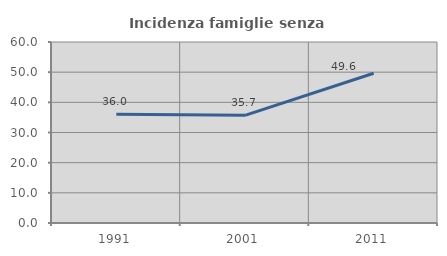
| Category | Incidenza famiglie senza nuclei |
|---|---|
| 1991.0 | 36.042 |
| 2001.0 | 35.688 |
| 2011.0 | 49.63 |